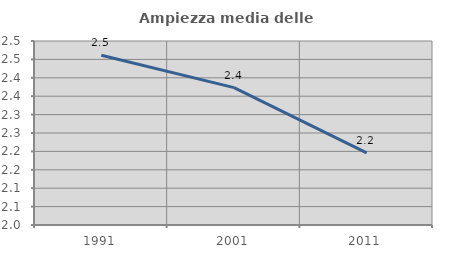
| Category | Ampiezza media delle famiglie |
|---|---|
| 1991.0 | 2.461 |
| 2001.0 | 2.373 |
| 2011.0 | 2.196 |